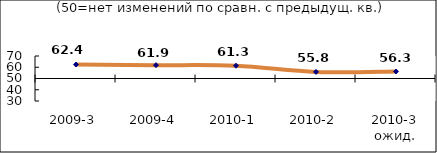
| Category | Диф.индекс ↓ |
|---|---|
| 2009-3 | 62.395 |
| 2009-4 | 61.865 |
| 2010-1 | 61.34 |
| 2010-2 | 55.83 |
| 2010-3 ожид. | 56.25 |